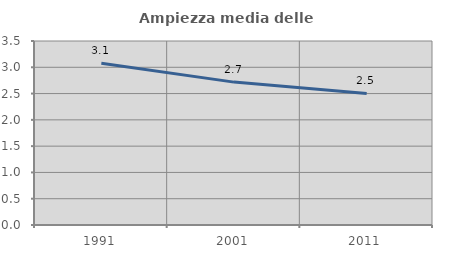
| Category | Ampiezza media delle famiglie |
|---|---|
| 1991.0 | 3.076 |
| 2001.0 | 2.718 |
| 2011.0 | 2.502 |